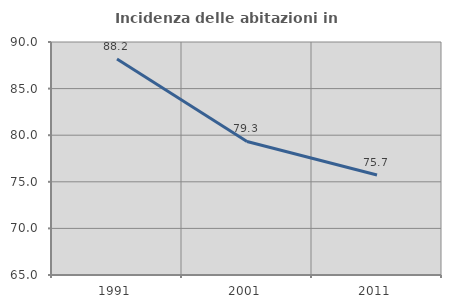
| Category | Incidenza delle abitazioni in proprietà  |
|---|---|
| 1991.0 | 88.169 |
| 2001.0 | 79.327 |
| 2011.0 | 75.723 |